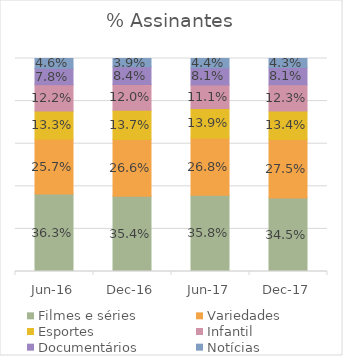
| Category | Filmes e séries | Variedades | Esportes | Infantil | Documentários | Notícias |
|---|---|---|---|---|---|---|
| 2016-06-01 | 0.363 | 0.257 | 0.133 | 0.122 | 0.078 | 0.046 |
| 2016-12-01 | 0.354 | 0.266 | 0.137 | 0.12 | 0.084 | 0.039 |
| 2017-06-01 | 0.358 | 0.268 | 0.139 | 0.111 | 0.081 | 0.044 |
| 2017-12-01 | 0.345 | 0.275 | 0.134 | 0.123 | 0.081 | 0.043 |